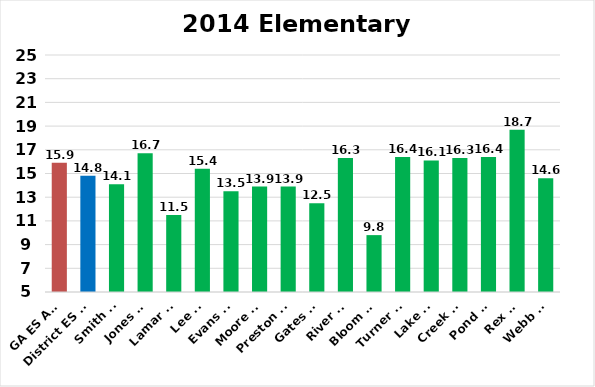
| Category | SGPs |
|---|---|
| GA ES Avg | 15.9 |
| District ES Avg | 14.8 |
| Smith ES | 14.1 |
| Jones ES | 16.7 |
| Lamar ES | 11.5 |
| Lee ES | 15.4 |
| Evans ES | 13.5 |
| Moore ES | 13.9 |
| Preston ES | 13.9 |
| Gates ES | 12.5 |
| River ES | 16.3 |
| Bloom ES | 9.8 |
| Turner ES | 16.4 |
| Lake ES | 16.1 |
| Creek ES | 16.3 |
| Pond ES | 16.4 |
| Rex ES | 18.7 |
| Webb ES | 14.6 |